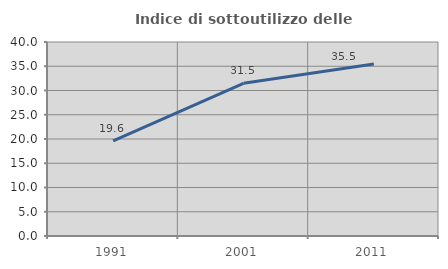
| Category | Indice di sottoutilizzo delle abitazioni  |
|---|---|
| 1991.0 | 19.636 |
| 2001.0 | 31.478 |
| 2011.0 | 35.468 |